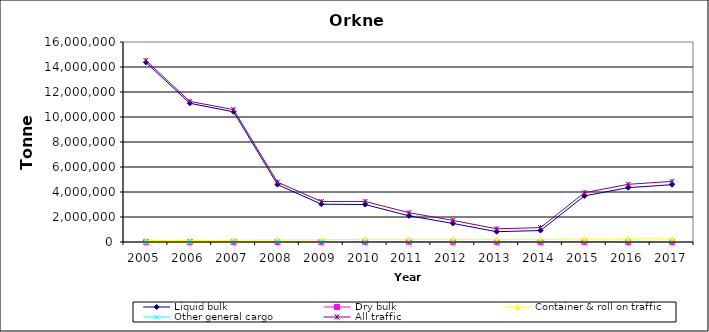
| Category | Liquid bulk | Dry bulk | Container & roll on traffic | Other general cargo | All traffic |
|---|---|---|---|---|---|
| 2005.0 | 14375000 | 15000 | 115000 | 29000 | 14534000 |
| 2006.0 | 11100000 | 12000 | 115000 | 21000 | 11249000 |
| 2007.0 | 10413000 | 10000 | 153000 | 16000 | 10592000 |
| 2008.0 | 4594000 | 6000 | 161000 | 29000 | 4789000 |
| 2009.0 | 3026438 | 12410 | 181740 | 20906 | 3241494 |
| 2010.0 | 2998000 | 20000 | 213000 | 14000 | 3244000 |
| 2011.0 | 2095000 | 25000 | 211000 | 13000 | 2344000 |
| 2012.0 | 1486000 | 15000 | 215000 | 13000 | 1729000 |
| 2013.0 | 824000 | 11000 | 208000 | 11000 | 1054000 |
| 2014.0 | 918000 | 12000 | 209000 | 12000 | 1151000 |
| 2015.0 | 3688000 | 16000 | 234000 | 7000 | 3945000 |
| 2016.0 | 4348000 | 9000 | 243000 | 15000 | 4615000 |
| 2017.0 | 4585000 | 9000 | 242000 | 16000 | 4852000 |